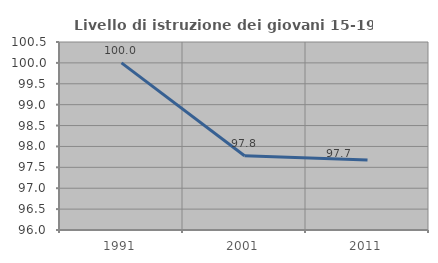
| Category | Livello di istruzione dei giovani 15-19 anni |
|---|---|
| 1991.0 | 100 |
| 2001.0 | 97.778 |
| 2011.0 | 97.674 |